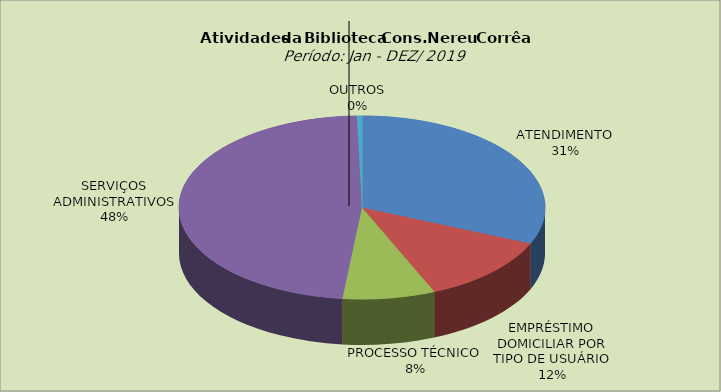
| Category | Series 0 |
|---|---|
| ATENDIMENTO | 31.431 |
| EMPRÉSTIMO DOMICILIAR POR TIPO DE USUÁRIO | 12.117 |
| PROCESSO TÉCNICO | 8.158 |
| SERVIÇOS ADMINISTRATIVOS | 47.846 |
| OUTROS | 0.448 |